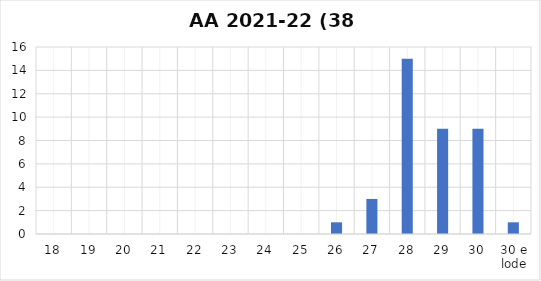
| Category | Series 0 |
|---|---|
| 18 | 0 |
| 19 | 0 |
| 20 | 0 |
| 21 | 0 |
| 22 | 0 |
| 23 | 0 |
| 24 | 0 |
| 25 | 0 |
| 26 | 1 |
| 27 | 3 |
| 28 | 15 |
| 29 | 9 |
| 30 | 9 |
| 30 e lode | 1 |